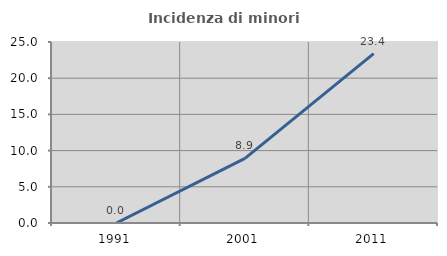
| Category | Incidenza di minori stranieri |
|---|---|
| 1991.0 | 0 |
| 2001.0 | 8.929 |
| 2011.0 | 23.404 |